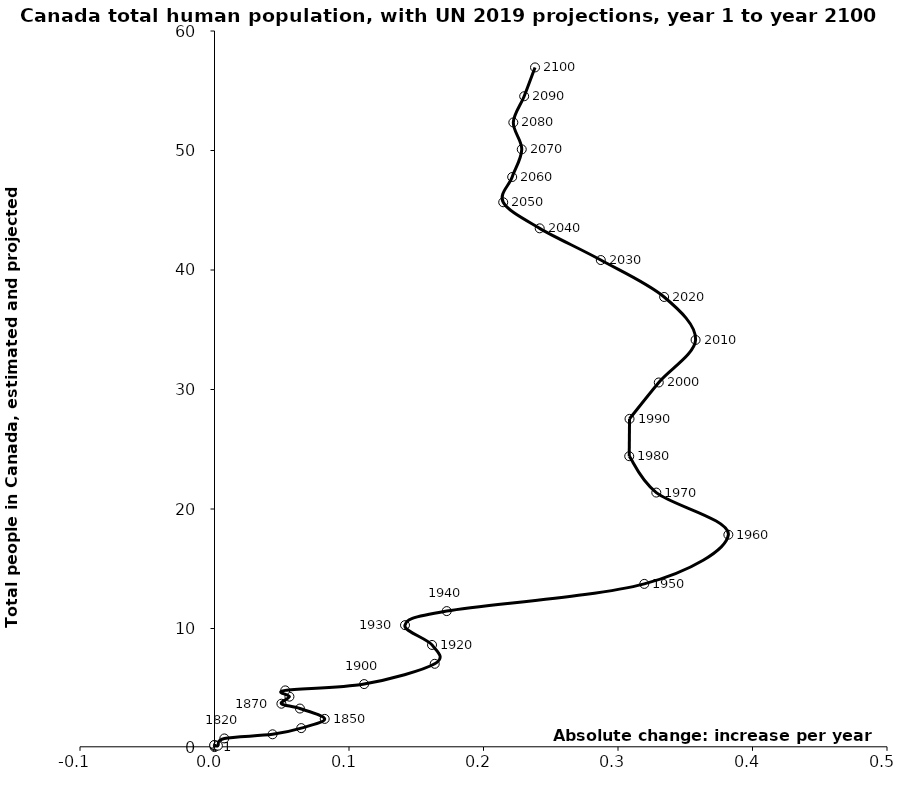
| Category | Series 0 |
|---|---|
| 7.84149710941403e-05 | 0.078 |
| 0.00011116198370583599 | 0.157 |
| 0.00014702807080151307 | 0.245 |
| -0.0002450467846691884 | 0.245 |
| 0.0025217541840501937 | 0.196 |
| 0.007306164133675187 | 0.8 |
| 0.043177243458711004 | 1.146 |
| 0.06449631372493039 | 1.663 |
| 0.08194364479337662 | 2.436 |
| 0.06351612658625364 | 3.302 |
| 0.049744497287845246 | 3.706 |
| 0.055723638833773445 | 4.297 |
| 0.05258703999000782 | 4.821 |
| 0.11125124023981155 | 5.349 |
| 0.1637402615159517 | 7.046 |
| 0.16173087788166432 | 8.624 |
| 0.14163704153879095 | 10.28 |
| 0.17265996447791016 | 11.456 |
| 0.3195488861573052 | 13.733 |
| 0.3820461999999999 | 17.847 |
| 0.32847405000000035 | 21.374 |
| 0.3083496500000004 | 24.417 |
| 0.30857484999999885 | 27.541 |
| 0.3303122500000001 | 30.588 |
| 0.35768855000000066 | 34.148 |
| 0.33430814999999897 | 37.742 |
| 0.28720619999999963 | 40.834 |
| 0.24178570000000085 | 43.486 |
| 0.2146592000000016 | 45.669 |
| 0.22132835000000206 | 47.779 |
| 0.2284423499999985 | 50.096 |
| 0.22217644999999847 | 52.348 |
| 0.23024590000000095 | 54.54 |
| 0.23831535000000342 | 56.953 |